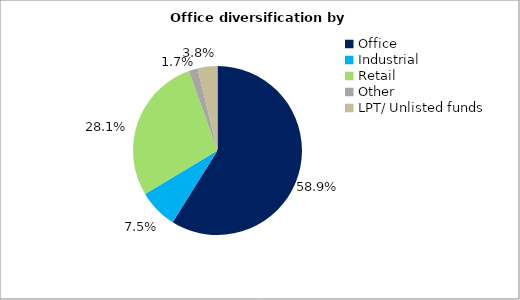
| Category | Series 0 |
|---|---|
| Office | 0.589 |
| Industrial  | 0.075 |
| Retail  | 0.281 |
| Other | 0.017 |
| LPT/ Unlisted funds | 0.038 |